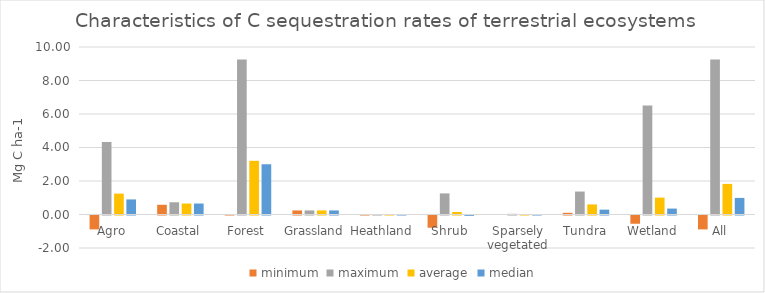
| Category | n | minimum | maximum | average | median |
|---|---|---|---|---|---|
| Agro |  | -0.83 | 4.33 | 1.247 | 0.9 |
| Coastal |  | 0.58 | 0.73 | 0.655 | 0.655 |
| Forest |  | 0.02 | 9.26 | 3.205 | 3 |
| Grassland |  | 0.242 | 0.242 | 0.242 | 0.242 |
| Heathland |  | 0.019 | 0.019 | 0.019 | 0.019 |
| Shrub |  | -0.73 | 1.26 | 0.148 | -0.02 |
| Sparsely vegetated |  | 0 | 0.04 | 0.02 | 0.02 |
| Tundra |  | 0.1 | 1.37 | 0.602 | 0.29 |
| Wetland |  | -0.493 | 6.5 | 1.007 | 0.354 |
| All |  | -0.83 | 9.26 | 1.827 | 0.99 |